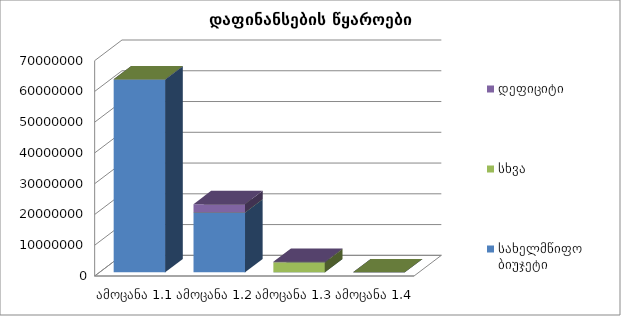
| Category |  სახელმწიფო ბიუჯეტი  |  სხვა  |  დეფიციტი  |
|---|---|---|---|
| ამოცანა 1.1 | 62689000 | 59999 | 0 |
| ამოცანა 1.2 | 19456300 | 0 | 2700000 |
| ამოცანა 1.3 | 2093 | 3239858.026 | 200000 |
| ამოცანა 1.4 | 27000 | 5000 | 0 |